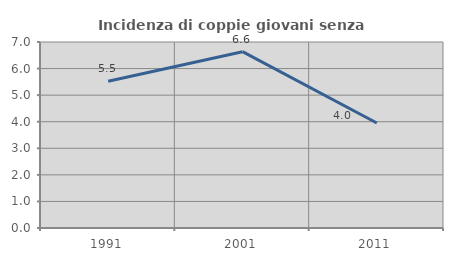
| Category | Incidenza di coppie giovani senza figli |
|---|---|
| 1991.0 | 5.525 |
| 2001.0 | 6.635 |
| 2011.0 | 3.953 |